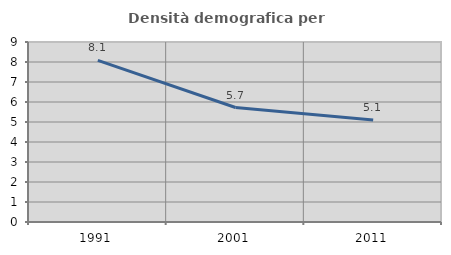
| Category | Densità demografica |
|---|---|
| 1991.0 | 8.081 |
| 2001.0 | 5.724 |
| 2011.0 | 5.099 |